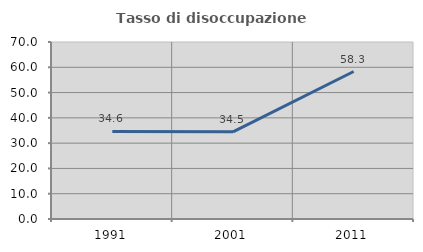
| Category | Tasso di disoccupazione giovanile  |
|---|---|
| 1991.0 | 34.615 |
| 2001.0 | 34.483 |
| 2011.0 | 58.333 |